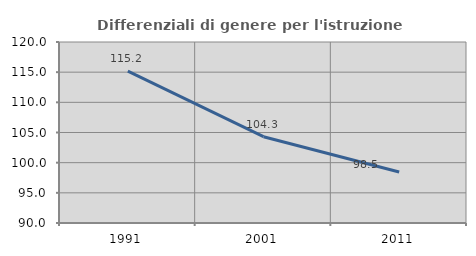
| Category | Differenziali di genere per l'istruzione superiore |
|---|---|
| 1991.0 | 115.187 |
| 2001.0 | 104.306 |
| 2011.0 | 98.464 |